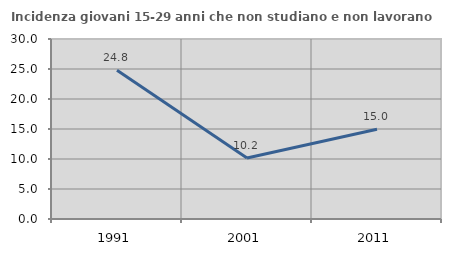
| Category | Incidenza giovani 15-29 anni che non studiano e non lavorano  |
|---|---|
| 1991.0 | 24.793 |
| 2001.0 | 10.157 |
| 2011.0 | 14.952 |